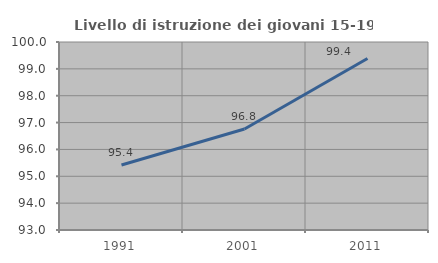
| Category | Livello di istruzione dei giovani 15-19 anni |
|---|---|
| 1991.0 | 95.418 |
| 2001.0 | 96.759 |
| 2011.0 | 99.387 |